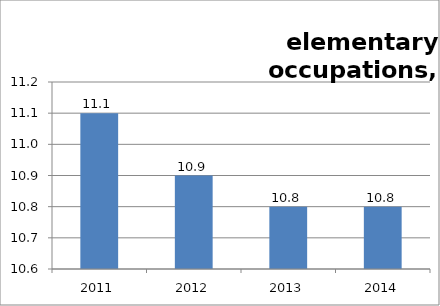
| Category | 9: Elementary occupations  |
|---|---|
| 2011.0 | 11.1 |
| 2012.0 | 10.9 |
| 2013.0 | 10.8 |
| 2014.0 | 10.8 |